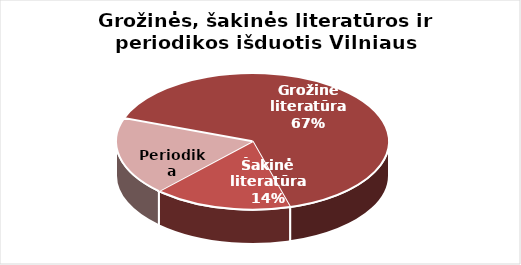
| Category | Series 0 |
|---|---|
| Grožinė literatūra | 960959 |
| Šakinė literatūra | 243261 |
| Periodika | 274067 |